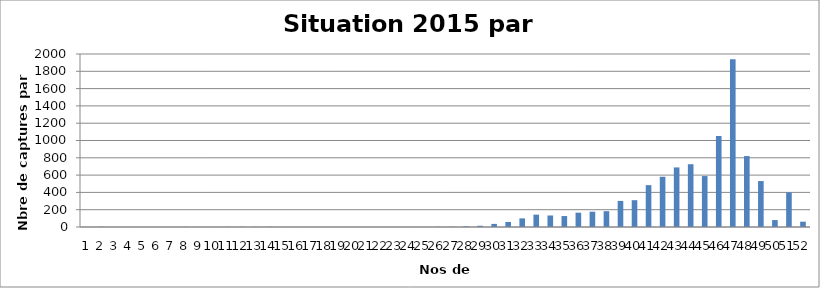
| Category | Series 0 |
|---|---|
| 0 | 1.18 |
| 1 | 2.711 |
| 2 | 0.365 |
| 3 | 1.26 |
| 4 | 0.838 |
| 5 | 0.8 |
| 6 | 0.121 |
| 7 | 1.597 |
| 8 | 0.416 |
| 9 | 1.026 |
| 10 | 1.814 |
| 11 | 2.42 |
| 12 | 1.91 |
| 13 | 2.677 |
| 14 | 1.419 |
| 15 | 1.42 |
| 16 | 0.621 |
| 17 | 0.502 |
| 18 | 0.313 |
| 19 | 0.514 |
| 20 | 0.165 |
| 21 | 0.903 |
| 22 | 0.796 |
| 23 | 0.978 |
| 24 | 1.232 |
| 25 | 2.216 |
| 26 | 2.666 |
| 27 | 7.381 |
| 28 | 14.4 |
| 29 | 35.885 |
| 30 | 58.417 |
| 31 | 99.737 |
| 32 | 142.874 |
| 33 | 133.021 |
| 34 | 126.575 |
| 35 | 165.488 |
| 36 | 176.984 |
| 37 | 182.823 |
| 38 | 301.631 |
| 39 | 309.994 |
| 40 | 483.814 |
| 41 | 580.861 |
| 42 | 688.683 |
| 43 | 725.797 |
| 44 | 588.891 |
| 45 | 1052.031 |
| 46 | 1938.449 |
| 47 | 819.975 |
| 48 | 531.03 |
| 49 | 80.089 |
| 50 | 400.012 |
| 51 | 61.248 |